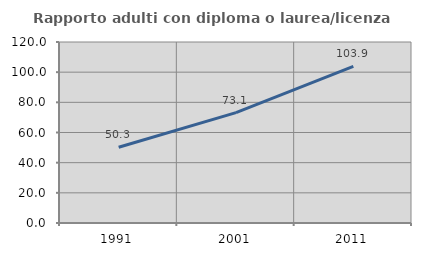
| Category | Rapporto adulti con diploma o laurea/licenza media  |
|---|---|
| 1991.0 | 50.255 |
| 2001.0 | 73.144 |
| 2011.0 | 103.887 |